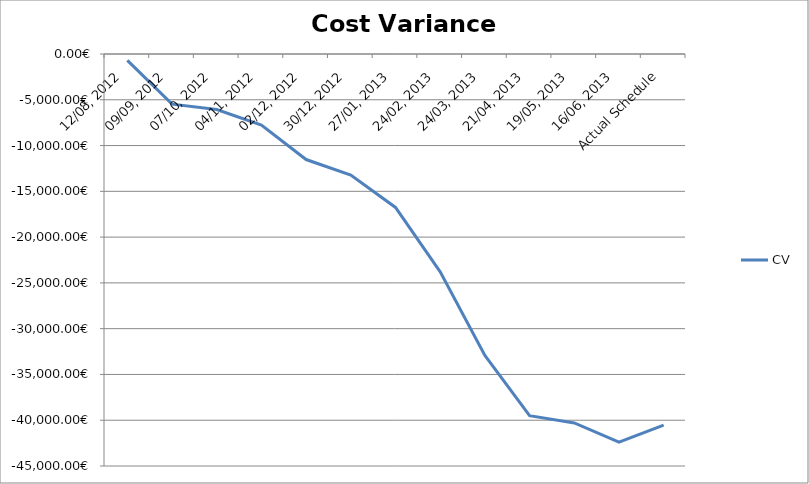
| Category | CV |
|---|---|
| 12/08, 2012 | -696 |
| 09/09, 2012 | -5481 |
| 07/10, 2012 | -6059.769 |
| 04/11, 2012 | -7771.571 |
| 02/12, 2012 | -11527.3 |
| 30/12, 2012 | -13225.02 |
| 27/01, 2013 | -16758.397 |
| 24/02, 2013 | -23786.937 |
| 24/03, 2013 | -32922.664 |
| 21/04, 2013 | -39497.735 |
| 19/05, 2013 | -40297.589 |
| 16/06, 2013 | -42392.311 |
| Actual Schedule | -40542 |